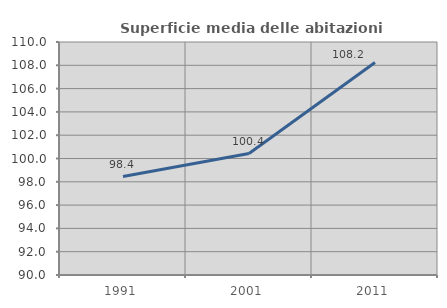
| Category | Superficie media delle abitazioni occupate |
|---|---|
| 1991.0 | 98.449 |
| 2001.0 | 100.427 |
| 2011.0 | 108.234 |